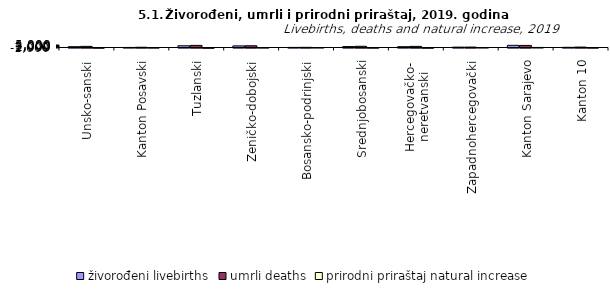
| Category | živorođeni livebirths | umrli deaths | prirodni priraštaj natural increase |
|---|---|---|---|
| Unsko-sanski | 1641 | 2261 | -620 |
| Kanton Posavski | 124 | 481 | -357 |
| Tuzlanski | 3457 | 4191 | -734 |
| Zeničko-dobojski | 3224 | 3492 | -268 |
| Bosansko-podrinjski | 191 | 317 | -126 |
| Srednjobosanski | 1875 | 2381 | -506 |
| Hercegovačko-
neretvanski | 1602 | 2231 | -629 |
| Zapadnohercegovački | 716 | 831 | -115 |
| Kanton Sarajevo | 4320 | 4174 | 146 |
| Kanton 10 | 340 | 839 | -499 |